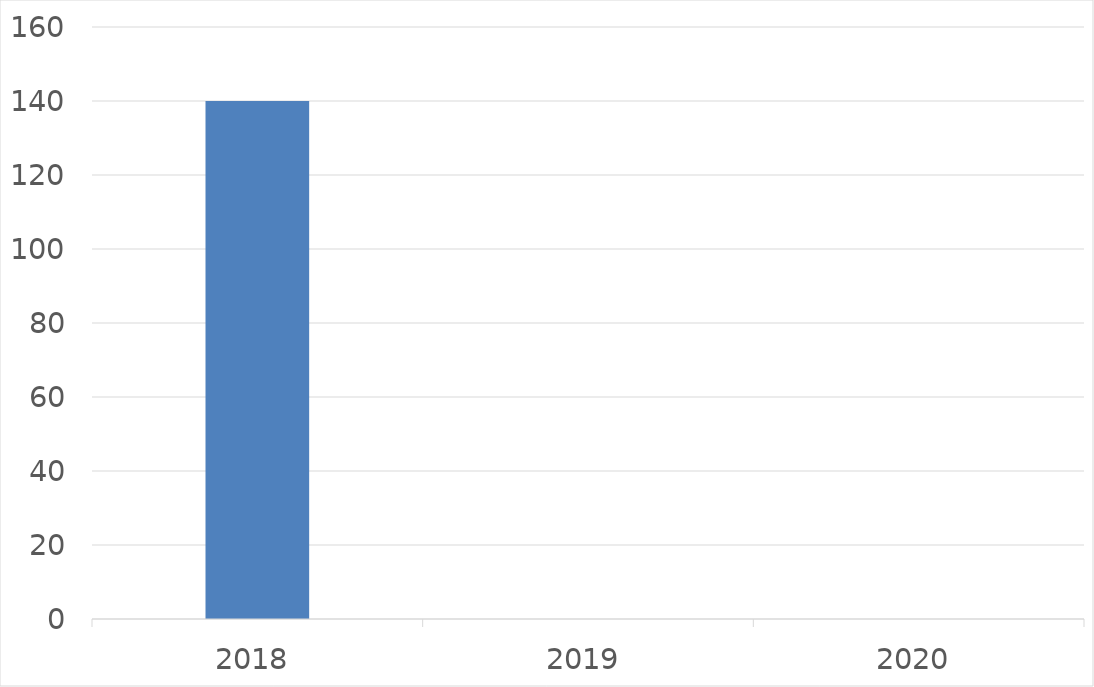
| Category | Series 0 |
|---|---|
| 2018 | 140 |
| 2019 | 0 |
| 2020 | 0 |